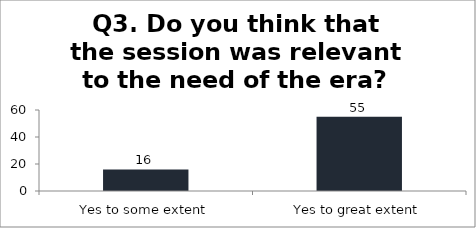
| Category | Q3. Do you think that the session was relevant to the need of the era? |
|---|---|
| Yes to some extent | 16 |
| Yes to great extent | 55 |